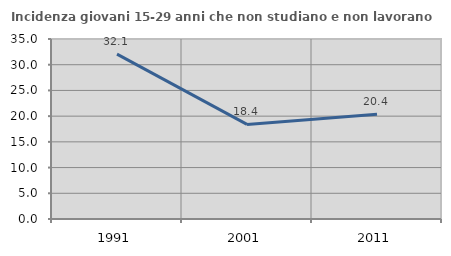
| Category | Incidenza giovani 15-29 anni che non studiano e non lavorano  |
|---|---|
| 1991.0 | 32.051 |
| 2001.0 | 18.392 |
| 2011.0 | 20.377 |